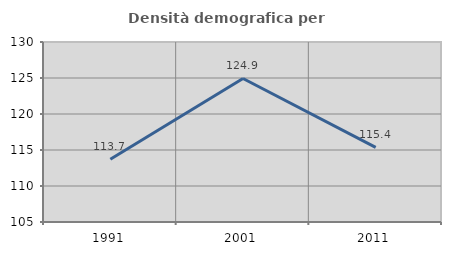
| Category | Densità demografica |
|---|---|
| 1991.0 | 113.724 |
| 2001.0 | 124.932 |
| 2011.0 | 115.373 |